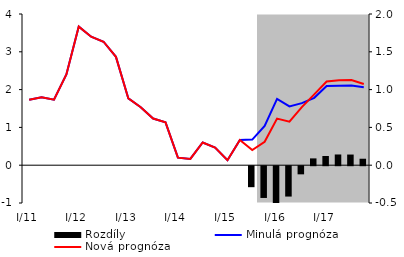
| Category | Rozdíly |
|---|---|
| 0 | 0 |
| 1 | 0 |
| 2 | 0 |
| 3 | 0 |
| 4 | 0 |
| 5 | 0 |
| 6 | 0 |
| 7 | 0 |
| 8 | 0 |
| 9 | 0 |
| 10 | 0 |
| 11 | 0 |
| 12 | 0 |
| 13 | 0 |
| 14 | 0 |
| 15 | 0 |
| 16 | 0 |
| 17 | 0 |
| 18 | -0.278 |
| 19 | -0.42 |
| 20 | -0.522 |
| 21 | -0.402 |
| 22 | -0.108 |
| 23 | 0.09 |
| 24 | 0.122 |
| 25 | 0.142 |
| 26 | 0.141 |
| 27 | 0.086 |